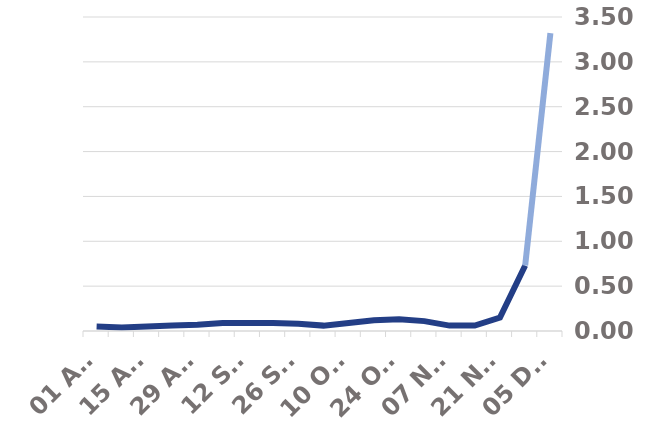
| Category | Percent_classificable_SGTF |
|---|---|
| 01 Aug | 0.05 |
| 08 Aug | 0.04 |
| 15 Aug | 0.05 |
| 22 Aug | 0.06 |
| 29 Aug | 0.07 |
| 05 Sep | 0.09 |
| 12 Sep | 0.09 |
| 19 Sep | 0.09 |
| 26 Sep | 0.08 |
| 03 Oct | 0.06 |
| 10 Oct | 0.09 |
| 17 Oct | 0.12 |
| 24 Oct | 0.13 |
| 31 Oct | 0.11 |
| 07 Nov | 0.06 |
| 14 Nov | 0.06 |
| 21 Nov | 0.15 |
| 28 Nov | 0.73 |
| 05 Dec | 3.32 |